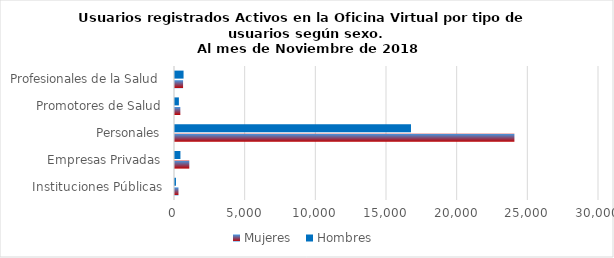
| Category | Mujeres | Hombres |
|---|---|---|
| Instituciones Públicas | 246 | 67 |
| Empresas Privadas | 1011 | 384 |
| Personales | 24015 | 16697 |
| Promotores de Salud | 377 | 275 |
| Profesionales de la Salud | 571 | 605 |